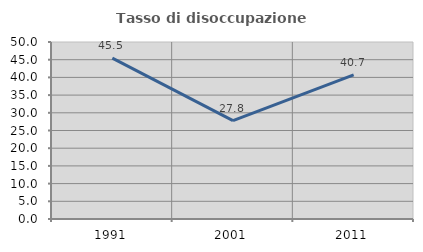
| Category | Tasso di disoccupazione giovanile  |
|---|---|
| 1991.0 | 45.455 |
| 2001.0 | 27.778 |
| 2011.0 | 40.698 |